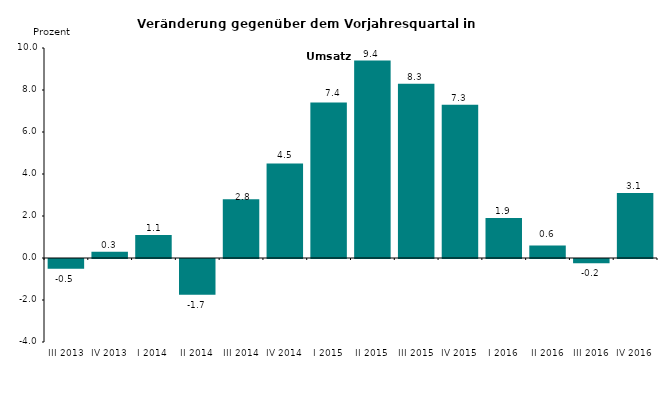
| Category | Series 0 |
|---|---|
| III 2013 | -0.465 |
| IV 2013 | 0.3 |
| I 2014 | 1.1 |
| II 2014 | -1.7 |
| III 2014 | 2.8 |
| IV 2014 | 4.5 |
| I 2015 | 7.4 |
| II 2015 | 9.4 |
| III 2015 | 8.3 |
| IV 2015 | 7.3 |
| I 2016 | 1.9 |
| II 2016 | 0.6 |
| III 2016 | -0.2 |
| IV 2016 | 3.1 |